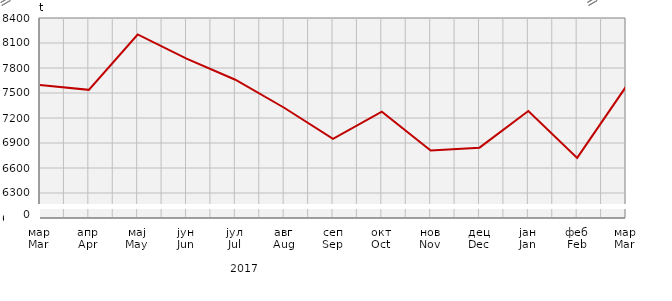
| Category | Прикупљање крављег млијека
Collecting of cow’s milk |
|---|---|
| мар
Mar | 7595.98 |
| апр
Apr | 7537.768 |
| мај
May | 8202.4 |
| јун
Jun | 7912.4 |
| јул
Jul | 7659 |
| авг
Aug | 7323 |
| сеп
Sep | 6949.6 |
| окт
Oct | 7275 |
| нов
Nov | 6810.8 |
| дец
Dec | 6844 |
| јан
Jan | 7283.5 |
| феб
Feb | 6721.8 |
| мар
Mar | 7575.8 |